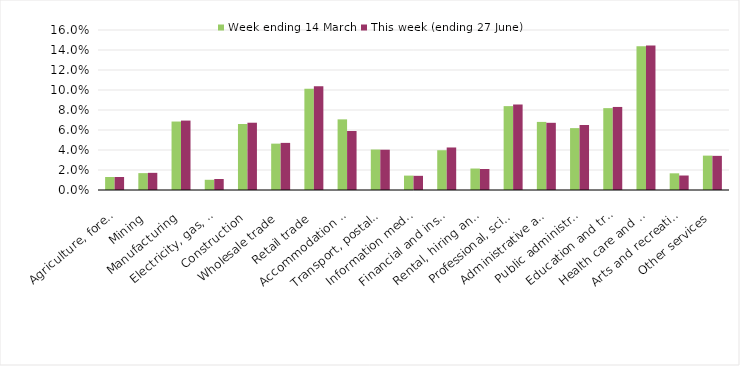
| Category | Week ending 14 March | This week (ending 27 June) |
|---|---|---|
| Agriculture, forestry and fishing | 0.013 | 0.013 |
| Mining | 0.017 | 0.017 |
| Manufacturing | 0.068 | 0.069 |
| Electricity, gas, water and waste services | 0.01 | 0.011 |
| Construction | 0.066 | 0.067 |
| Wholesale trade | 0.046 | 0.047 |
| Retail trade | 0.101 | 0.104 |
| Accommodation and food services | 0.071 | 0.059 |
| Transport, postal and warehousing | 0.04 | 0.04 |
| Information media and telecommunications | 0.014 | 0.014 |
| Financial and insurance services | 0.04 | 0.043 |
| Rental, hiring and real estate services | 0.021 | 0.021 |
| Professional, scientific and technical services | 0.084 | 0.085 |
| Administrative and support services | 0.068 | 0.067 |
| Public administration and safety | 0.062 | 0.065 |
| Education and training | 0.082 | 0.083 |
| Health care and social assistance | 0.144 | 0.144 |
| Arts and recreation services | 0.017 | 0.014 |
| Other services | 0.034 | 0.034 |